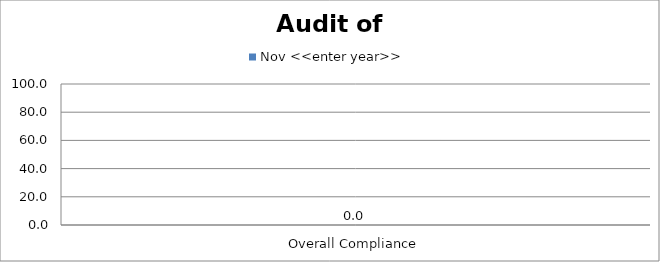
| Category | Nov <<enter year>> |
|---|---|
| Overall Compliance | 0 |